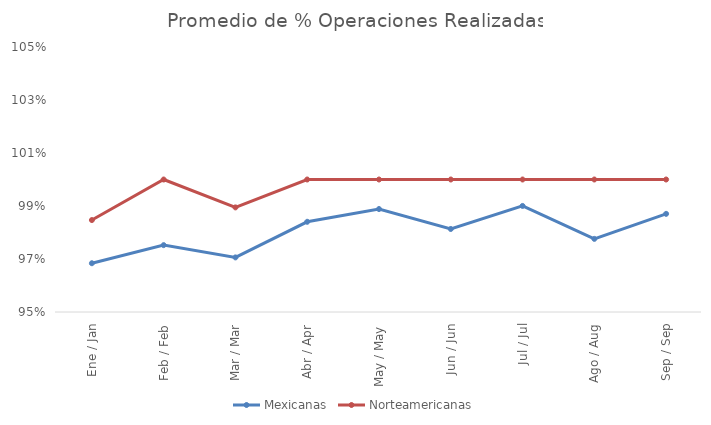
| Category | Mexicanas | Norteamericanas |
|---|---|---|
| Ene / Jan | 0.968 | 0.985 |
| Feb / Feb | 0.975 | 1 |
| Mar / Mar | 0.971 | 0.989 |
| Abr / Apr | 0.984 | 1 |
| May / May | 0.989 | 1 |
| Jun / Jun | 0.981 | 1 |
| Jul / Jul | 0.99 | 1 |
| Ago / Aug | 0.978 | 1 |
| Sep / Sep | 0.987 | 1 |